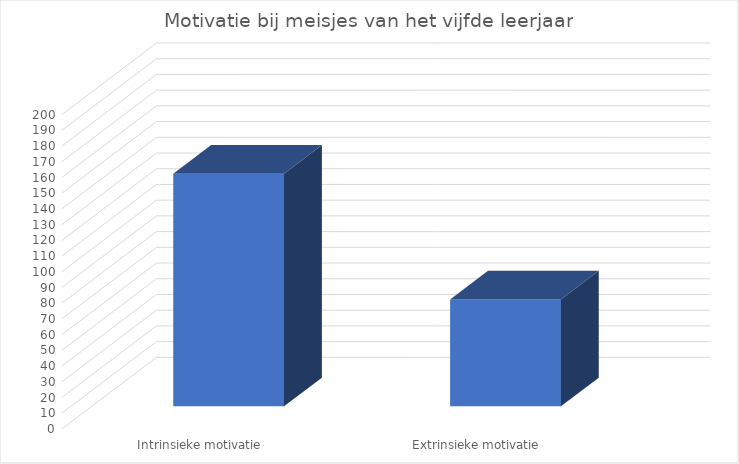
| Category | Series 0 |
|---|---|
| Intrinsieke motivatie | 148 |
| Extrinsieke motivatie | 68 |